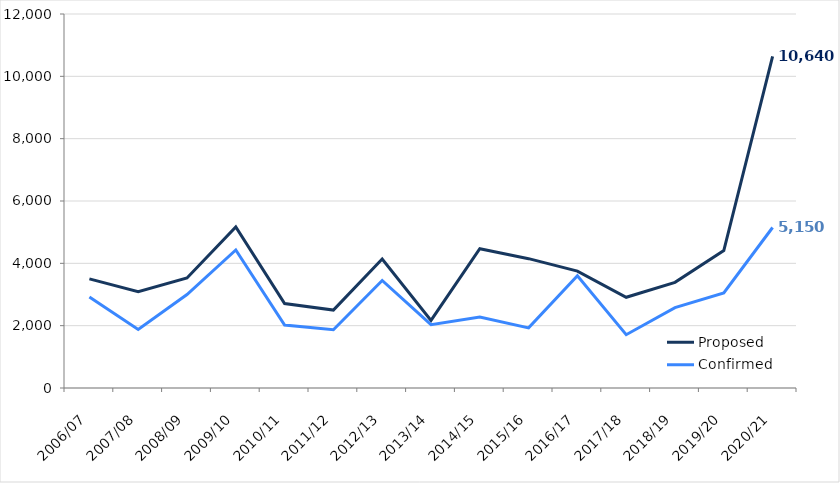
| Category | Proposed | Confirmed |
|---|---|---|
| 2006/07 | 3500 | 2920 |
| 2007/08 | 3090 | 1880 |
| 2008/09 | 3530 | 3000 |
| 2009/10 | 5170 | 4430 |
| 2010/11 | 2710 | 2020 |
| 2011/12 | 2500 | 1870 |
| 2012/13 | 4140 | 3450 |
| 2013/14 | 2170 | 2030 |
| 2014/15 | 4470 | 2280 |
| 2015/16 | 4150 | 1930 |
| 2016/17 | 3750 | 3600 |
| 2017/18 | 2910 | 1710 |
| 2018/19 | 3390 | 2580 |
| 2019/20 | 4410 | 3050 |
| 2020/21 | 10640 | 5150 |